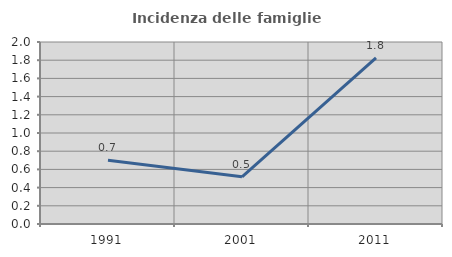
| Category | Incidenza delle famiglie numerose |
|---|---|
| 1991.0 | 0.702 |
| 2001.0 | 0.518 |
| 2011.0 | 1.826 |